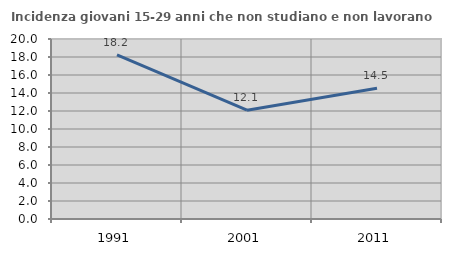
| Category | Incidenza giovani 15-29 anni che non studiano e non lavorano  |
|---|---|
| 1991.0 | 18.236 |
| 2001.0 | 12.095 |
| 2011.0 | 14.537 |